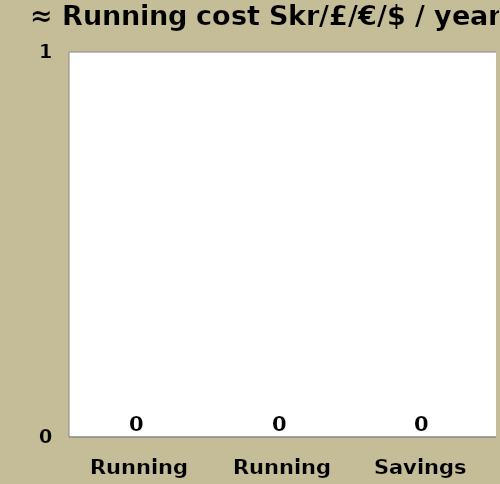
| Category | Series 0 |
|---|---|
| Running cost Standard | 0 |
| Running cost with X-BLOCK | 0 |
| Savings  | 0 |